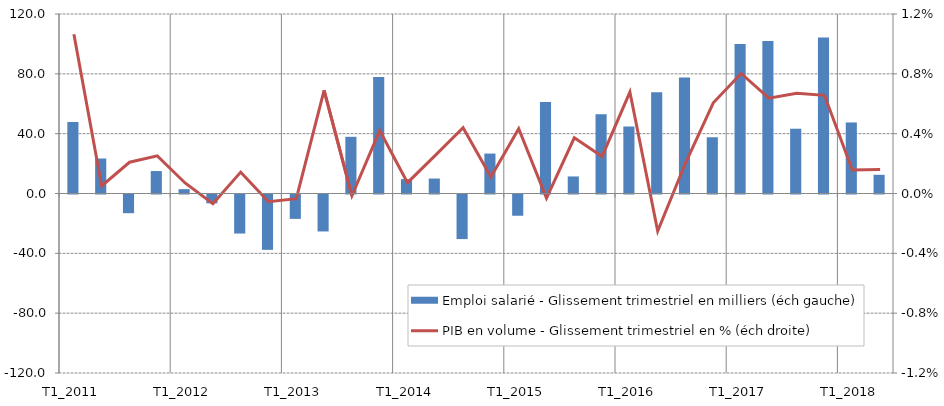
| Category | Emploi salarié - Glissement trimestriel en milliers (éch gauche) |
|---|---|
| T1_2011 | 47.8 |
| T2_2011 | 23.4 |
| T3_2011 | -12.5 |
| T4_2011 | 15 |
| T1_2012 | 2.9 |
| T2_2012 | -5.9 |
| T3_2012 | -26.1 |
| T4_2012 | -37 |
| T1_2013 | -16.3 |
| T2_2013 | -24.7 |
| T3_2013 | 37.9 |
| T4_2013 | 77.8 |
| T1_2014 | 9.6 |
| T2_2014 | 10 |
| T3_2014 | -29.8 |
| T4_2014 | 26.7 |
| T1_2015 | -14.2 |
| T2_2015 | 61.2 |
| T3_2015 | 11.4 |
| T4_2015 | 53 |
| T1_2016 | 44.8 |
| T2_2016 | 67.7 |
| T3_2016 | 77.6 |
| T4_2016 | 37.6 |
| T1_2017 | 100 |
| T2_2017 | 102 |
| T3_2017 | 43.3 |
| T4_2017 | 104.3 |
| T1_2018 | 47.5 |
| T2_2018 | 12.5 |